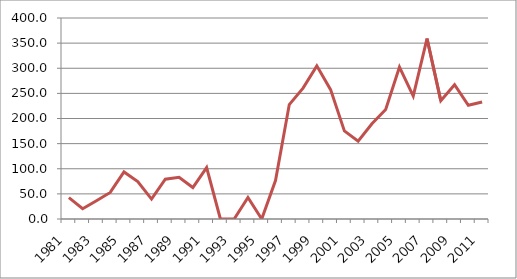
| Category | Series 1 |
|---|---|
| 1981.0 | 42.45 |
| 1982.0 | 20.538 |
| 1983.0 | 36.469 |
| 1984.0 | 52.895 |
| 1985.0 | 93.722 |
| 1986.0 | 74.557 |
| 1987.0 | 39.628 |
| 1988.0 | 79.258 |
| 1989.0 | 83.179 |
| 1990.0 | 62.616 |
| 1991.0 | 102.353 |
| 1992.0 | 0 |
| 1993.0 | 0 |
| 1994.0 | 42.848 |
| 1995.0 | 0 |
| 1996.0 | 76.379 |
| 1997.0 | 227.679 |
| 1998.0 | 260.472 |
| 1999.0 | 304.756 |
| 2000.0 | 257.416 |
| 2001.0 | 175.281 |
| 2002.0 | 154.763 |
| 2003.0 | 189.398 |
| 2004.0 | 218.044 |
| 2005.0 | 302.316 |
| 2006.0 | 244.693 |
| 2007.0 | 359.11 |
| 2008.0 | 235.54 |
| 2009.0 | 267.319 |
| 2010.0 | 226.278 |
| 2011.0 | 232.899 |